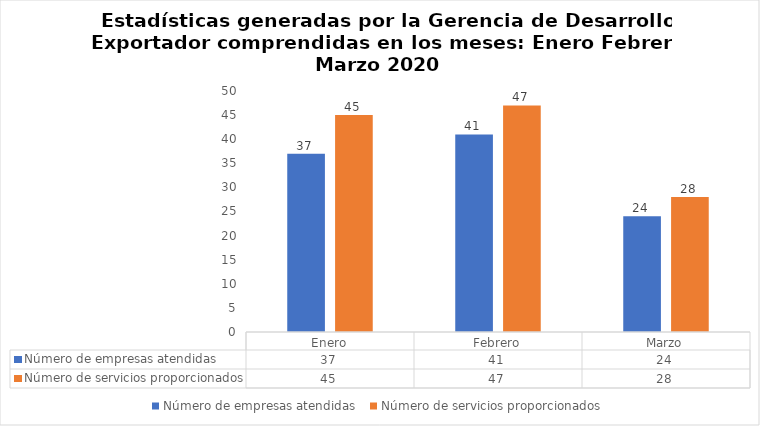
| Category | Número de empresas atendidas  | Número de servicios proporcionados |
|---|---|---|
| Enero | 37 | 45 |
| Febrero | 41 | 47 |
| Marzo | 24 | 28 |